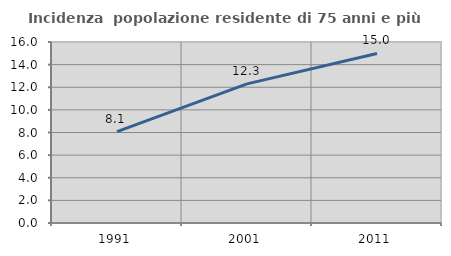
| Category | Incidenza  popolazione residente di 75 anni e più |
|---|---|
| 1991.0 | 8.072 |
| 2001.0 | 12.297 |
| 2011.0 | 14.986 |